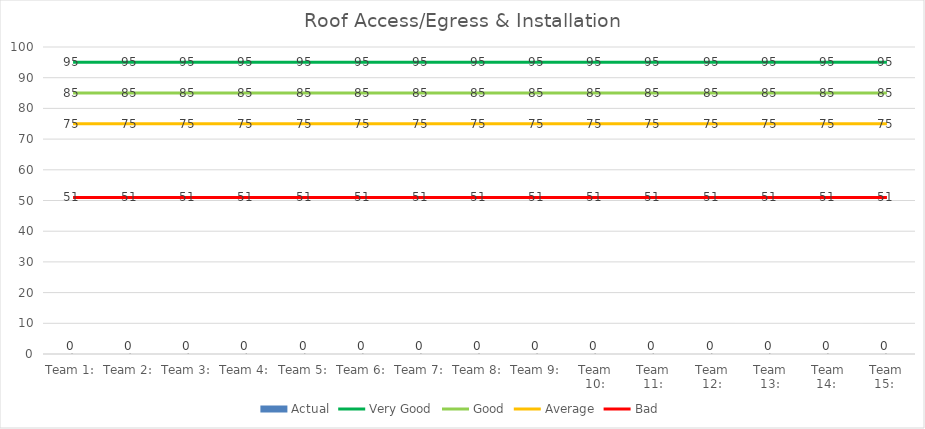
| Category | Actual |
|---|---|
| Team 1: | 0 |
| Team 2: | 0 |
| Team 3: | 0 |
| Team 4: | 0 |
| Team 5: | 0 |
| Team 6: | 0 |
| Team 7: | 0 |
| Team 8: | 0 |
| Team 9: | 0 |
| Team 10: | 0 |
| Team 11: | 0 |
| Team 12: | 0 |
| Team 13: | 0 |
| Team 14:  | 0 |
| Team 15:  | 0 |